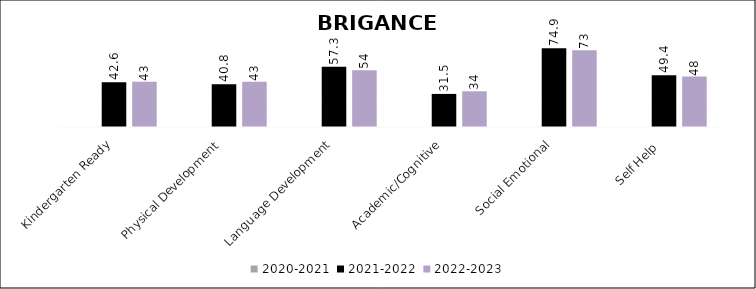
| Category | 2020-2021 | 2021-2022 | 2022-2023 |
|---|---|---|---|
| Kindergarten Ready | 0 | 42.6 | 43 |
| Physical Development | 0 | 40.8 | 43 |
| Language Development | 0 | 57.3 | 54 |
| Academic/Cognitive | 0 | 31.5 | 34 |
| Social Emotional | 0 | 74.9 | 73 |
| Self Help  | 0 | 49.4 | 48 |